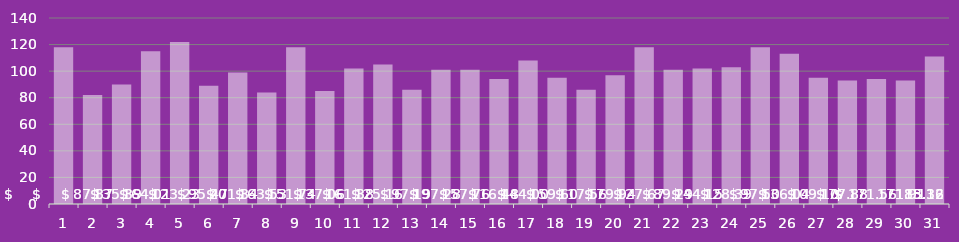
| Category | MQL |
|---|---|
| 1.0 | 118 |
| 2.0 | 82 |
| 3.0 | 90 |
| 4.0 | 115 |
| 5.0 | 122 |
| 6.0 | 89 |
| 7.0 | 99 |
| 8.0 | 84 |
| 9.0 | 118 |
| 10.0 | 85 |
| 11.0 | 102 |
| 12.0 | 105 |
| 13.0 | 86 |
| 14.0 | 101 |
| 15.0 | 101 |
| 16.0 | 94 |
| 17.0 | 108 |
| 18.0 | 95 |
| 19.0 | 86 |
| 20.0 | 97 |
| 21.0 | 118 |
| 22.0 | 101 |
| 23.0 | 102 |
| 24.0 | 103 |
| 25.0 | 118 |
| 26.0 | 113 |
| 27.0 | 95 |
| 28.0 | 93 |
| 29.0 | 94 |
| 30.0 | 93 |
| 31.0 | 111 |